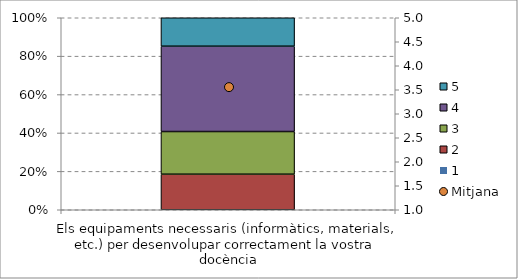
| Category | 1 | 2 | 3 | 4 | 5 |
|---|---|---|---|---|---|
| Els equipaments necessaris (informàtics, materials, etc.) per desenvolupar correctament la vostra docència | 0 | 0.185 | 0.222 | 0.444 | 0.148 |